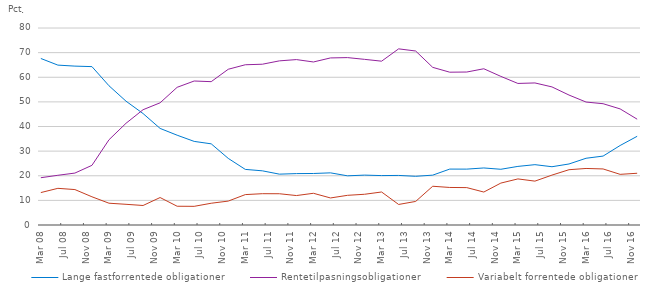
| Category | Lange fastforrentede obligationer | Rentetilpasningsobligationer | Variabelt forrentede obligationer |
|---|---|---|---|
| 2008-03-01 | 67.625 | 19.205 | 13.17 |
| 2008-06-01 | 64.925 | 20.189 | 14.886 |
| 2008-09-01 | 64.521 | 21.09 | 14.389 |
| 2008-12-01 | 64.315 | 24.229 | 11.455 |
| 2009-03-01 | 56.537 | 34.615 | 8.848 |
| 2009-06-01 | 50.285 | 41.312 | 8.404 |
| 2009-09-01 | 45.256 | 46.821 | 7.923 |
| 2009-12-01 | 39.224 | 49.621 | 11.155 |
| 2010-03-01 | 36.466 | 55.915 | 7.62 |
| 2010-06-01 | 33.951 | 58.472 | 7.577 |
| 2010-09-01 | 32.96 | 58.206 | 8.833 |
| 2010-12-01 | 27.045 | 63.243 | 9.712 |
| 2011-03-01 | 22.582 | 65.075 | 12.343 |
| 2011-06-01 | 21.999 | 65.288 | 12.713 |
| 2011-09-01 | 20.65 | 66.655 | 12.695 |
| 2011-12-01 | 20.87 | 67.175 | 11.955 |
| 2012-03-01 | 20.916 | 66.205 | 12.879 |
| 2012-06-01 | 21.176 | 67.845 | 10.979 |
| 2012-09-01 | 19.971 | 67.979 | 12.05 |
| 2012-12-01 | 20.254 | 67.266 | 12.48 |
| 2013-03-01 | 20.068 | 66.529 | 13.403 |
| 2013-06-01 | 20.13 | 71.532 | 8.338 |
| 2013-09-01 | 19.774 | 70.656 | 9.57 |
| 2013-12-01 | 20.243 | 64.021 | 15.736 |
| 2014-03-01 | 22.705 | 62.051 | 15.244 |
| 2014-06-01 | 22.697 | 62.123 | 15.181 |
| 2014-09-01 | 23.164 | 63.449 | 13.387 |
| 2014-12-01 | 22.628 | 60.352 | 17.019 |
| 2015-03-01 | 23.797 | 57.487 | 18.716 |
| 2015-06-01 | 24.5 | 57.685 | 17.815 |
| 2015-09-01 | 23.662 | 56.077 | 20.261 |
| 2015-12-01 | 24.78 | 52.767 | 22.452 |
| 2016-03-01 | 27.106 | 49.934 | 22.96 |
| 2016-06-01 | 27.984 | 49.255 | 22.761 |
| 2016-09-01 | 32.282 | 47.149 | 20.569 |
| 2016-12-01 | 36.022 | 42.966 | 21.011 |